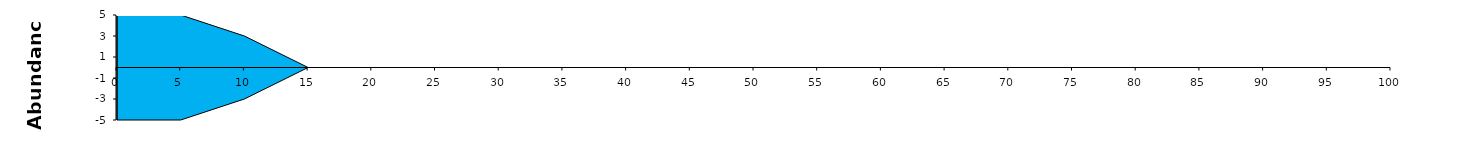
| Category | Series 0 | Series 1 |
|---|---|---|
| 0.0 | 5 | -5 |
| 5.0 | 5 | -5 |
| 10.0 | 3 | -3 |
| 15.0 | 0 | 0 |
| 20.0 | 0 | 0 |
| 25.0 | 0 | 0 |
| 30.0 | 0 | 0 |
| 35.0 | 0 | 0 |
| 40.0 | 0 | 0 |
| 45.0 | 0 | 0 |
| 50.0 | 0 | 0 |
| 55.0 | 0 | 0 |
| 60.0 | 0 | 0 |
| 65.0 | 0 | 0 |
| 70.0 | 0 | 0 |
| 75.0 | 0 | 0 |
| 80.0 | 0 | 0 |
| 85.0 | 0 | 0 |
| 90.0 | 0 | 0 |
| 95.0 | 0 | 0 |
| 100.0 | 0 | 0 |